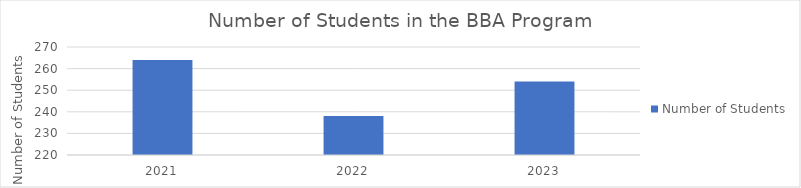
| Category | Number of Students |
|---|---|
| 2021.0 | 264 |
| 2022.0 | 238 |
| 2023.0 | 254 |